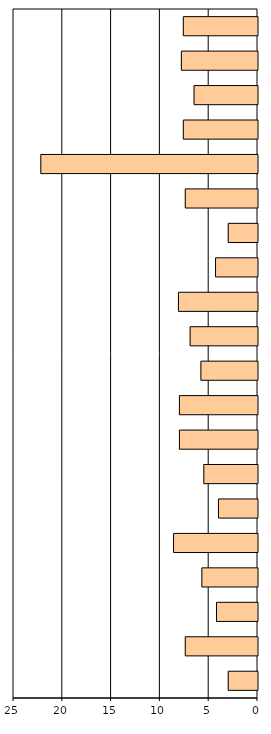
| Category | Series 0 |
|---|---|
| 0 | 3 |
| 1 | 7.4 |
| 2 | 4.2 |
| 3 | 5.7 |
| 4 | 8.6 |
| 5 | 4 |
| 6 | 5.5 |
| 7 | 8 |
| 8 | 8 |
| 9 | 5.8 |
| 10 | 6.9 |
| 11 | 8.1 |
| 12 | 4.3 |
| 13 | 3 |
| 14 | 7.4 |
| 15 | 22.2 |
| 16 | 7.6 |
| 17 | 6.5 |
| 18 | 7.8 |
| 19 | 7.6 |